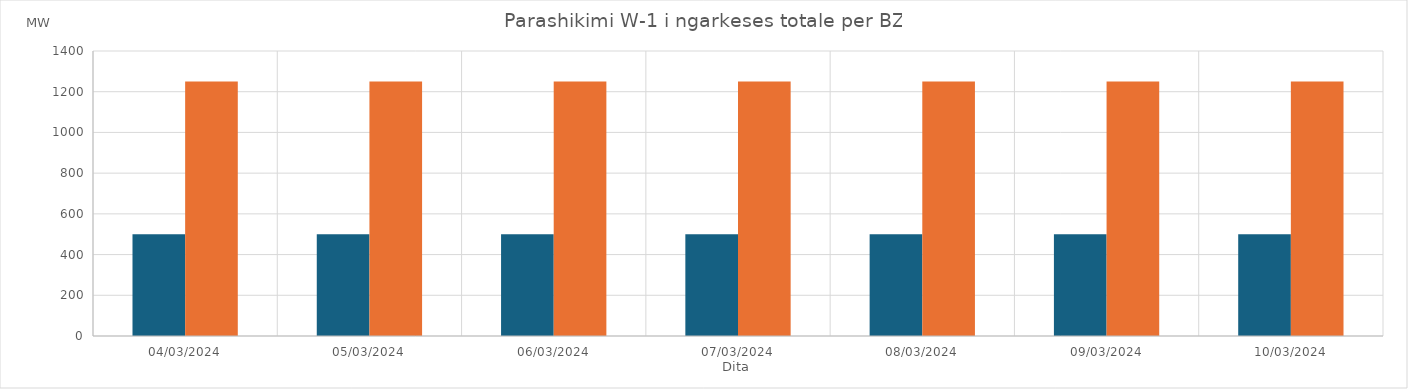
| Category | Min (MW) | Max (MW) |
|---|---|---|
| 04/03/2024 | 500 | 1250 |
| 05/03/2024 | 500 | 1250 |
| 06/03/2024 | 500 | 1250 |
| 07/03/2024 | 500 | 1250 |
| 08/03/2024 | 500 | 1250 |
| 09/03/2024 | 500 | 1250 |
| 10/03/2024 | 500 | 1250 |